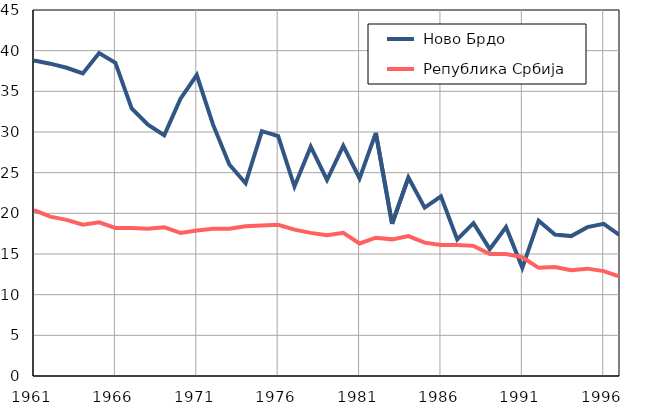
| Category |  Ново Брдо |  Република Србија |
|---|---|---|
| 1961.0 | 38.8 | 20.4 |
| 1962.0 | 38.4 | 19.6 |
| 1963.0 | 37.9 | 19.2 |
| 1964.0 | 37.2 | 18.6 |
| 1965.0 | 39.7 | 18.9 |
| 1966.0 | 38.5 | 18.2 |
| 1967.0 | 32.9 | 18.2 |
| 1968.0 | 30.9 | 18.1 |
| 1969.0 | 29.6 | 18.3 |
| 1970.0 | 34.1 | 17.6 |
| 1971.0 | 37 | 17.9 |
| 1972.0 | 30.9 | 18.1 |
| 1973.0 | 26 | 18.1 |
| 1974.0 | 23.7 | 18.4 |
| 1975.0 | 30.1 | 18.5 |
| 1976.0 | 29.5 | 18.6 |
| 1977.0 | 23.3 | 18 |
| 1978.0 | 28.2 | 17.6 |
| 1979.0 | 24.1 | 17.3 |
| 1980.0 | 28.3 | 17.6 |
| 1981.0 | 24.3 | 16.3 |
| 1982.0 | 29.9 | 17 |
| 1983.0 | 18.7 | 16.8 |
| 1984.0 | 24.4 | 17.2 |
| 1985.0 | 20.7 | 16.4 |
| 1986.0 | 22.1 | 16.1 |
| 1987.0 | 16.8 | 16.1 |
| 1988.0 | 18.8 | 16 |
| 1989.0 | 15.6 | 15 |
| 1990.0 | 18.3 | 15 |
| 1991.0 | 13.3 | 14.6 |
| 1992.0 | 19.1 | 13.3 |
| 1993.0 | 17.4 | 13.4 |
| 1994.0 | 17.2 | 13 |
| 1995.0 | 18.3 | 13.2 |
| 1996.0 | 18.7 | 12.9 |
| 1997.0 | 17.3 | 12.2 |